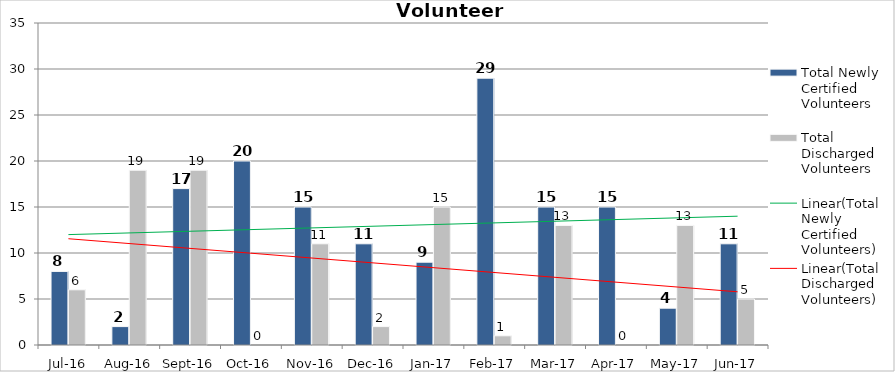
| Category | Total Newly Certified Volunteers | Total Discharged Volunteers |
|---|---|---|
| Jul-16 | 8 | 6 |
| Aug-16 | 2 | 19 |
| Sep-16 | 17 | 19 |
| Oct-16 | 20 | 0 |
| Nov-16 | 15 | 11 |
| Dec-16 | 11 | 2 |
| Jan-17 | 9 | 15 |
| Feb-17 | 29 | 1 |
| Mar-17 | 15 | 13 |
| Apr-17 | 15 | 0 |
| May-17 | 4 | 13 |
| Jun-17 | 11 | 5 |